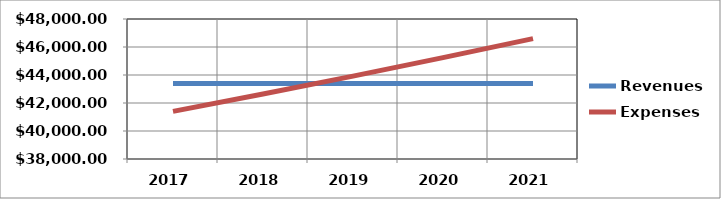
| Category | Revenues | Expenses |
|---|---|---|
| 2017.0 | 43400 | 41400 |
| 2018.0 | 43400 | 42642 |
| 2019.0 | 43400 | 43921 |
| 2020.0 | 43400 | 45239 |
| 2021.0 | 43400 | 46596 |